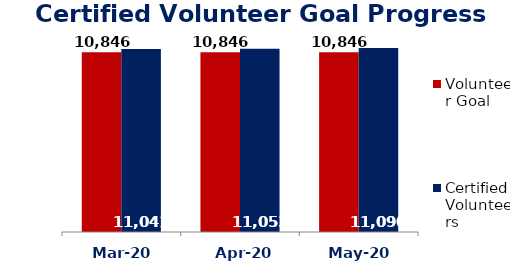
| Category | Volunteer Goal  | Certified Volunteers  |
|---|---|---|
| Mar-20 | 10846 | 11041 |
| Apr-20 | 10846 | 11053 |
| May-20 | 10846 | 11090 |